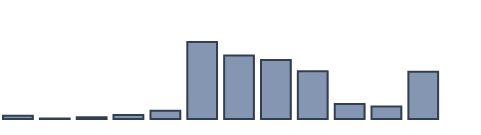
| Category | Series 0 |
|---|---|
| 0 | 0.97 |
| 1 | 0.14 |
| 2 | 0.539 |
| 3 | 1.213 |
| 4 | 2.425 |
| 5 | 22.666 |
| 6 | 18.711 |
| 7 | 17.383 |
| 8 | 14.016 |
| 9 | 4.393 |
| 10 | 3.678 |
| 11 | 13.867 |
| 12 | 0 |